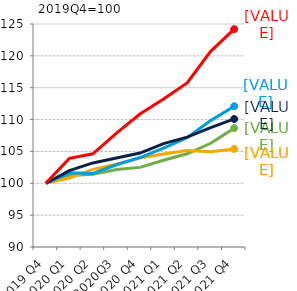
| Category | Északi országok | Mediterrán országok | KKE-régió | Magországok | Magyarország |
|---|---|---|---|---|---|
| 2019 Q4 | 100 | 100 | 100 | 100 | 100 |
| 2020 Q1 | 101.225 | 100.832 | 101.649 | 101.992 | 103.911 |
| 2020 Q2 | 101.399 | 102.187 | 101.537 | 103.198 | 104.634 |
| 2020Q3 | 102.164 | 103.009 | 102.902 | 103.981 | 107.885 |
| 2020 Q4 | 102.495 | 103.968 | 104.041 | 104.75 | 110.88 |
| 2021 Q1 | 103.617 | 104.582 | 105.507 | 106.221 | 113.218 |
| 2021 Q2 | 104.633 | 105.132 | 107.143 | 107.244 | 115.757 |
| 2021 Q3 | 106.278 | 104.934 | 109.837 | 108.722 | 120.704 |
| 2021 Q4 | 108.654 | 105.385 | 112.09 | 110.095 | 124.191 |